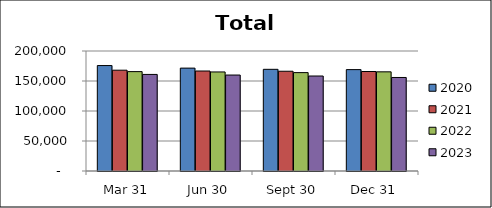
| Category | 2020 | 2021 | 2022 | 2023 |
|---|---|---|---|---|
| Mar 31 | 175739 | 167995 | 165635 | 160962 |
| Jun 30 | 171484 | 166656 | 165084 | 159922 |
| Sept 30 | 169463 | 166255 | 163979 | 158311 |
| Dec 31 | 168965 | 165829 | 165283 | 155885 |